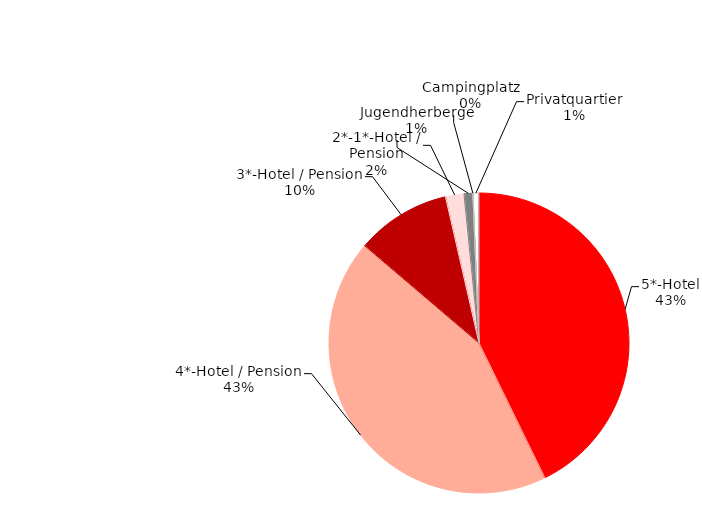
| Category | Series 0 |
|---|---|
| 5*-Hotel | 42.762 |
| 4*-Hotel / Pension | 43.463 |
| 3*-Hotel / Pension | 10.189 |
| 2*-1*-Hotel / Pension | 1.987 |
| Jugendherberge | 0.944 |
| Campingplatz | 0.003 |
| Privatquartier | 0.652 |